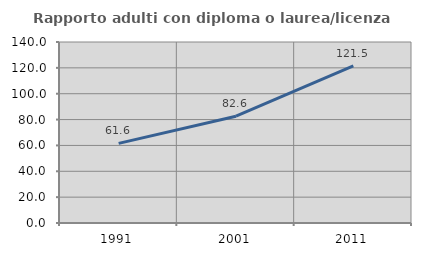
| Category | Rapporto adulti con diploma o laurea/licenza media  |
|---|---|
| 1991.0 | 61.613 |
| 2001.0 | 82.574 |
| 2011.0 | 121.543 |